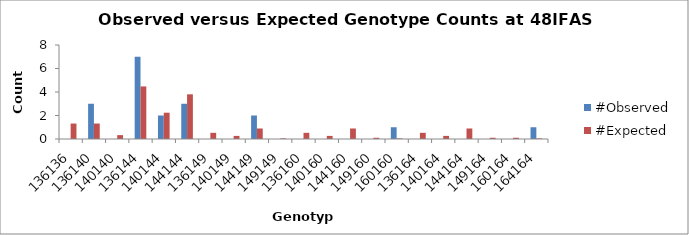
| Category | #Observed | #Expected |
|---|---|---|
| 136136.0 | 0 | 1.316 |
| 136140.0 | 3 | 1.316 |
| 140140.0 | 0 | 0.329 |
| 136144.0 | 7 | 4.474 |
| 140144.0 | 2 | 2.237 |
| 144144.0 | 3 | 3.803 |
| 136149.0 | 0 | 0.526 |
| 140149.0 | 0 | 0.263 |
| 144149.0 | 2 | 0.895 |
| 149149.0 | 0 | 0.053 |
| 136160.0 | 0 | 0.526 |
| 140160.0 | 0 | 0.263 |
| 144160.0 | 0 | 0.895 |
| 149160.0 | 0 | 0.105 |
| 160160.0 | 1 | 0.053 |
| 136164.0 | 0 | 0.526 |
| 140164.0 | 0 | 0.263 |
| 144164.0 | 0 | 0.895 |
| 149164.0 | 0 | 0.105 |
| 160164.0 | 0 | 0.105 |
| 164164.0 | 1 | 0.053 |